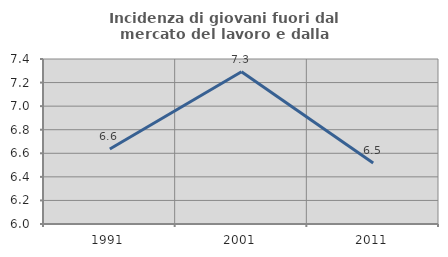
| Category | Incidenza di giovani fuori dal mercato del lavoro e dalla formazione  |
|---|---|
| 1991.0 | 6.636 |
| 2001.0 | 7.292 |
| 2011.0 | 6.517 |